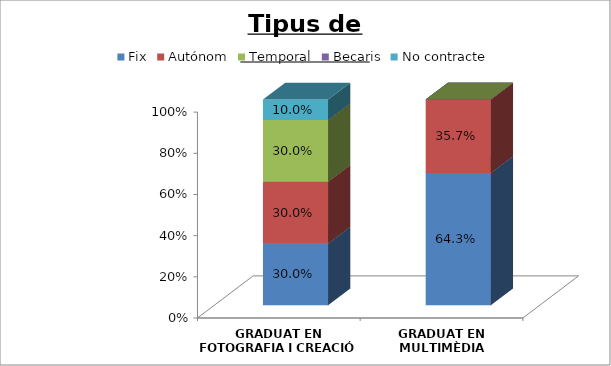
| Category | Fix | Autónom | Temporal | Becaris | No contracte |
|---|---|---|---|---|---|
| GRADUAT EN FOTOGRAFIA I CREACIÓ DIGITAL | 0.3 | 0.3 | 0.3 | 0 | 0.1 |
| GRADUAT EN MULTIMÈDIA | 0.643 | 0.357 | 0 | 0 | 0 |